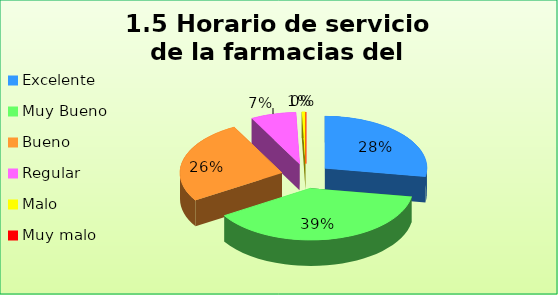
| Category | Series 0 |
|---|---|
| Excelente | 0.276 |
| Muy Bueno | 0.385 |
| Bueno  | 0.261 |
| Regular  | 0.072 |
| Malo  | 0.006 |
| Muy malo  | 0 |